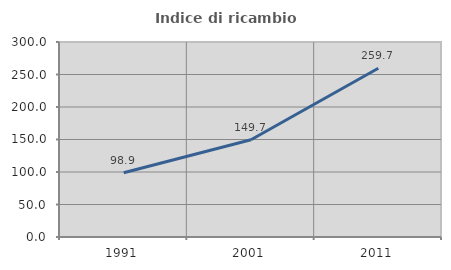
| Category | Indice di ricambio occupazionale  |
|---|---|
| 1991.0 | 98.894 |
| 2001.0 | 149.716 |
| 2011.0 | 259.712 |